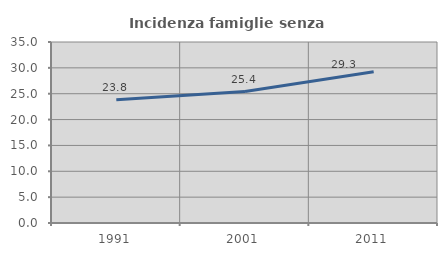
| Category | Incidenza famiglie senza nuclei |
|---|---|
| 1991.0 | 23.821 |
| 2001.0 | 25.417 |
| 2011.0 | 29.26 |